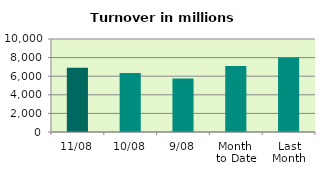
| Category | Series 0 |
|---|---|
| 11/08 | 6903.581 |
| 10/08 | 6334.261 |
| 9/08 | 5756.244 |
| Month 
to Date | 7090.494 |
| Last
Month | 8019.786 |